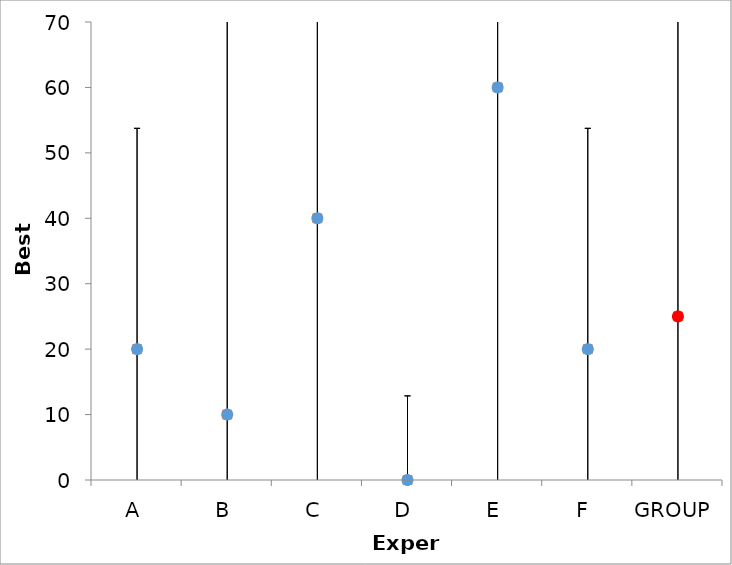
| Category | Series 1 | Series 0 |
|---|---|---|
| A | 20 | 20 |
| B | 10 | 10 |
| C | 40 | 40 |
| D | 0 | 0 |
| E | 60 | 60 |
| F | 20 | 20 |
| GROUP | 25 | 25 |